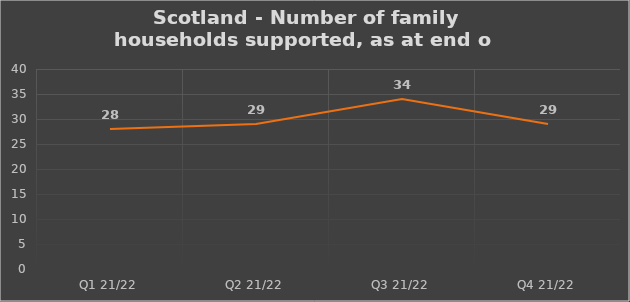
| Category | Number of financially supported households at end of quarter |
|---|---|
| Q1 21/22 | 28 |
| Q2 21/22 | 29 |
| Q3 21/22 | 34 |
| Q4 21/22 | 29 |